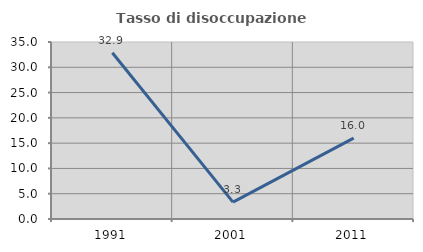
| Category | Tasso di disoccupazione giovanile  |
|---|---|
| 1991.0 | 32.877 |
| 2001.0 | 3.333 |
| 2011.0 | 16 |